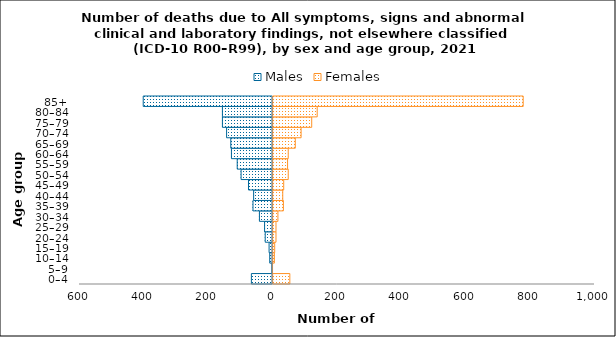
| Category | Males | Females |
|---|---|---|
| 0–4 | -66 | 55 |
| 5–9 | -2 | 1 |
| 10–14 | -9 | 7 |
| 15–19 | -11 | 8 |
| 20–24 | -23 | 12 |
| 25–29 | -25 | 12 |
| 30–34 | -41 | 18 |
| 35–39 | -61 | 35 |
| 40–44 | -59 | 33 |
| 45–49 | -75 | 36 |
| 50–54 | -98 | 50 |
| 55–59 | -110 | 48 |
| 60–64 | -128 | 50 |
| 65–69 | -130 | 72 |
| 70–74 | -143 | 90 |
| 75–79 | -156 | 123 |
| 80–84 | -156 | 140 |
| 85+ | -402 | 780 |